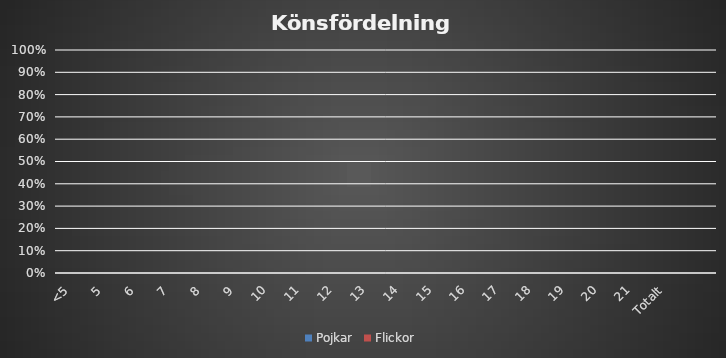
| Category | Pojkar | Flickor |
|---|---|---|
| <5 | 0 | 0 |
| 5 | 0 | 0 |
| 6 | 0 | 0 |
| 7 | 0 | 0 |
| 8 | 0 | 0 |
| 9 | 0 | 0 |
| 10 | 0 | 0 |
| 11 | 0 | 0 |
| 12 | 0 | 0 |
| 13 | 0 | 0 |
| 14 | 0 | 0 |
| 15 | 0 | 0 |
| 16 | 0 | 0 |
| 17 | 0 | 0 |
| 18 | 0 | 0 |
| 19 | 0 | 0 |
| 20 | 0 | 0 |
| 21 | 0 | 0 |
| Totalt | 0 | 0 |